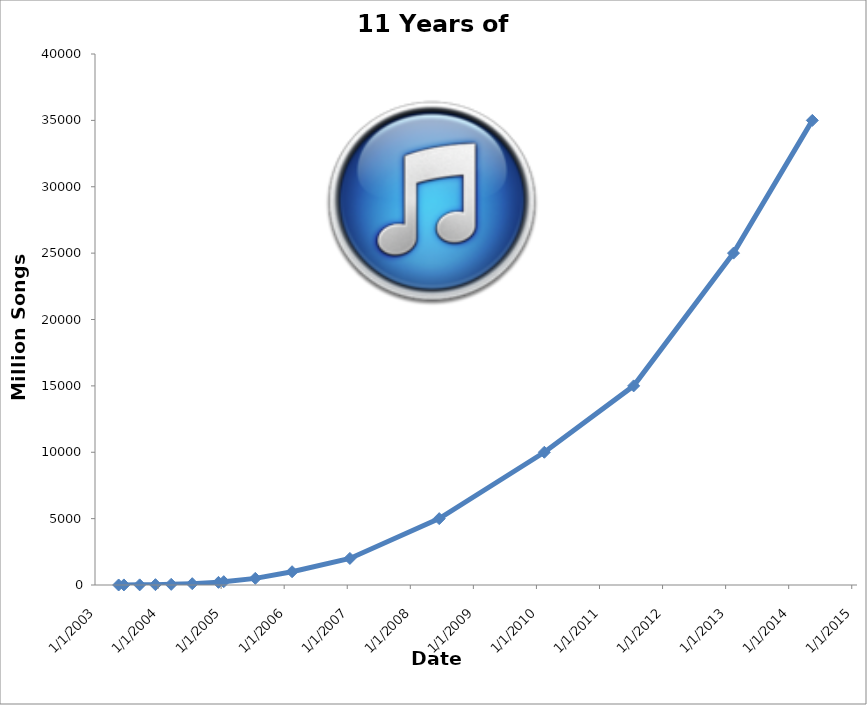
| Category | Million Songs Sold |
|---|---|
| 5/15/03 | 1 |
| 6/23/03 | 5 |
| 9/8/03 | 10 |
| 12/15/03 | 25 |
| 3/15/04 | 50 |
| 7/12/04 | 100 |
| 12/16/04 | 200 |
| 1/24/05 | 250 |
| 7/18/05 | 500 |
| 2/23/06 | 1000 |
| 1/9/07 | 2000 |
| 6/19/08 | 5000 |
| 2/25/10 | 10000 |
| 7/7/11 | 15000 |
| 2/6/13 | 25000 |
| 5/28/14 | 35000 |